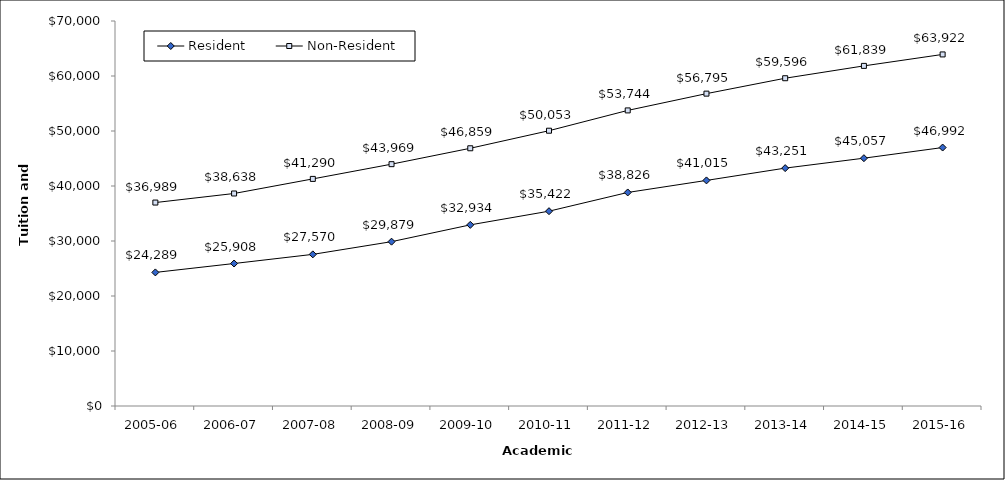
| Category | Resident | Non-Resident |
|---|---|---|
| 2005-06 | 24289 | 36989 |
| 2006-07 | 25908 | 38638 |
| 2007-08 | 27570 | 41290 |
| 2008-09 | 29879 | 43969 |
| 2009-10 | 32934 | 46859 |
| 2010-11 | 35422 | 50053 |
| 2011-12 | 38826 | 53744 |
| 2012-13 | 41015 | 56795 |
| 2013-14 | 43251 | 59596 |
| 2014-15 | 45057 | 61839 |
| 2015-16 | 46992 | 63922 |